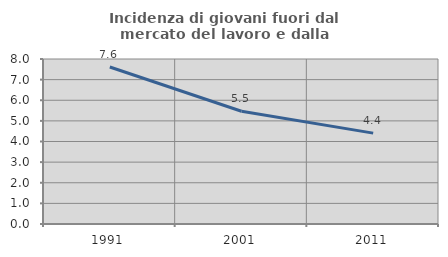
| Category | Incidenza di giovani fuori dal mercato del lavoro e dalla formazione  |
|---|---|
| 1991.0 | 7.612 |
| 2001.0 | 5.466 |
| 2011.0 | 4.407 |